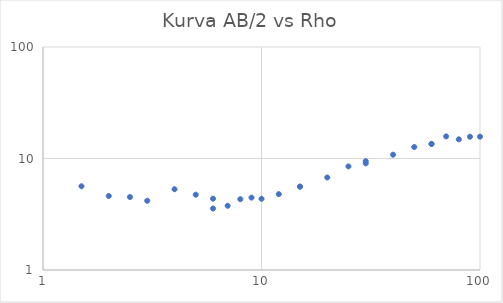
| Category | Series 0 |
|---|---|
| 1.5 | 5.635 |
| 2.0 | 4.612 |
| 2.5 | 4.513 |
| 3.0 | 4.177 |
| 4.0 | 5.301 |
| 5.0 | 4.735 |
| 6.0 | 4.361 |
| 6.0 | 3.56 |
| 7.0 | 3.767 |
| 8.0 | 4.316 |
| 9.0 | 4.46 |
| 10.0 | 4.354 |
| 12.0 | 4.793 |
| 15.0 | 5.604 |
| 15.0 | 5.579 |
| 20.0 | 6.757 |
| 25.0 | 8.495 |
| 30.0 | 9.471 |
| 30.0 | 9.039 |
| 40.0 | 10.817 |
| 50.0 | 12.676 |
| 60.0 | 13.502 |
| 60.0 | 13.524 |
| 70.0 | 15.783 |
| 80.0 | 14.864 |
| 90.0 | 15.676 |
| 100.0 | 15.697 |